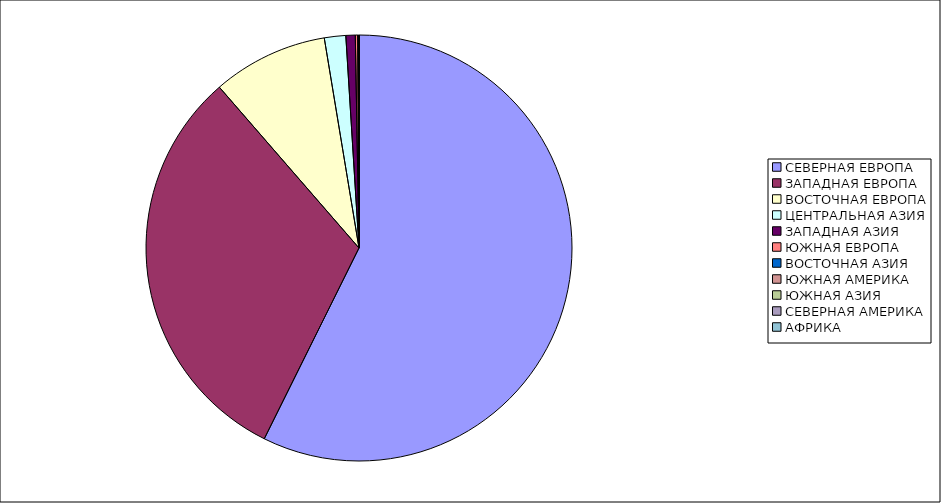
| Category | Оборот |
|---|---|
| СЕВЕРНАЯ ЕВРОПА | 57.336 |
| ЗАПАДНАЯ ЕВРОПА | 31.284 |
| ВОСТОЧНАЯ ЕВРОПА | 8.77 |
| ЦЕНТРАЛЬНАЯ АЗИЯ | 1.622 |
| ЗАПАДНАЯ АЗИЯ | 0.712 |
| ЮЖНАЯ ЕВРОПА | 0.18 |
| ВОСТОЧНАЯ АЗИЯ | 0.054 |
| ЮЖНАЯ АМЕРИКА | 0.03 |
| ЮЖНАЯ АЗИЯ | 0.008 |
| СЕВЕРНАЯ АМЕРИКА | 0.003 |
| АФРИКА | 0.001 |